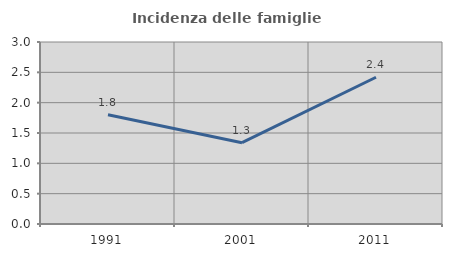
| Category | Incidenza delle famiglie numerose |
|---|---|
| 1991.0 | 1.799 |
| 2001.0 | 1.341 |
| 2011.0 | 2.419 |